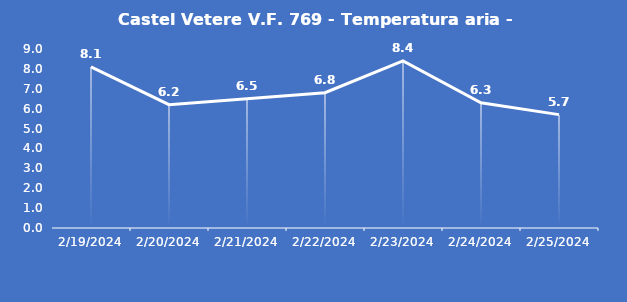
| Category | Castel Vetere V.F. 769 - Temperatura aria - Grezzo (°C) |
|---|---|
| 2/19/24 | 8.1 |
| 2/20/24 | 6.2 |
| 2/21/24 | 6.5 |
| 2/22/24 | 6.8 |
| 2/23/24 | 8.4 |
| 2/24/24 | 6.3 |
| 2/25/24 | 5.7 |